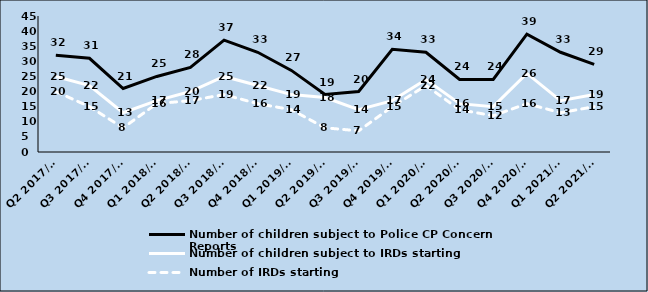
| Category | Number of children subject to Police CP Concern Reports | Number of children subject to IRDs starting | Number of IRDs starting |
|---|---|---|---|
| Q2 2017/18 | 32 | 25 | 20 |
| Q3 2017/18 | 31 | 22 | 15 |
| Q4 2017/18 | 21 | 13 | 8 |
| Q1 2018/19 | 25 | 17 | 16 |
| Q2 2018/19 | 28 | 20 | 17 |
| Q3 2018/19 | 37 | 25 | 19 |
| Q4 2018/19 | 33 | 22 | 16 |
| Q1 2019/20 | 27 | 19 | 14 |
| Q2 2019/20 | 19 | 18 | 8 |
| Q3 2019/20 | 20 | 14 | 7 |
| Q4 2019/20 | 34 | 17 | 15 |
| Q1 2020/21 | 33 | 24 | 22 |
| Q2 2020/21 | 24 | 16 | 14 |
| Q3 2020/21 | 24 | 15 | 12 |
| Q4 2020/21 | 39 | 26 | 16 |
| Q1 2021/22 | 33 | 17 | 13 |
| Q2 2021/22 | 29 | 19 | 15 |